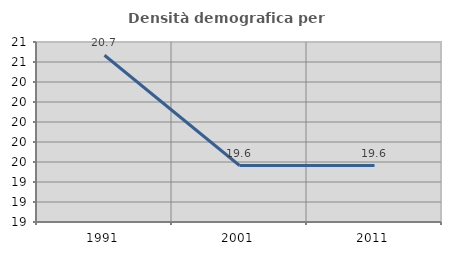
| Category | Densità demografica |
|---|---|
| 1991.0 | 20.667 |
| 2001.0 | 19.565 |
| 2011.0 | 19.565 |